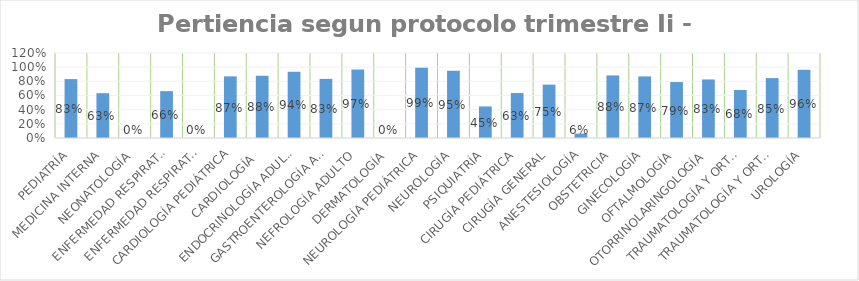
| Category | Series 0 |
|---|---|
| PEDIATRÍA | 0.832 |
| MEDICINA INTERNA | 0.632 |
| NEONATOLOGÍA | 0 |
| ENFERMEDAD RESPIRATORIA PEDIÁTRICA (BRONCOPULMONAR INFANTIL) | 0.662 |
| ENFERMEDAD RESPIRATORIA DE ADULTO (BRONCOPULMONAR) | 0 |
| CARDIOLOGÍA PEDIÁTRICA | 0.87 |
| CARDIOLOGÍA  | 0.879 |
| ENDOCRINOLOGÍA ADULTO | 0.936 |
| GASTROENTEROLOGÍA ADULTO | 0.834 |
| NEFROLOGÍA ADULTO | 0.968 |
| DERMATOLOGÍA | 0 |
| NEUROLOGÍA PEDIÁTRICA | 0.99 |
| NEUROLOGÍA | 0.948 |
| PSIQUIATRÍA | 0.445 |
| CIRUGÍA PEDIÁTRICA | 0.634 |
| CIRUGÍA GENERAL | 0.754 |
| ANESTESIOLOGÍA | 0.062 |
| OBSTETRICIA | 0.883 |
| GINECOLOGÍA | 0.87 |
| OFTALMOLOGÍA | 0.79 |
| OTORRINOLARINGOLOGÍA | 0.827 |
| TRAUMATOLOGÍA Y ORTOPEDIA PEDIÁTRICA | 0.678 |
| TRAUMATOLOGÍA Y ORTOPEDIA | 0.846 |
| UROLOGÍA | 0.963 |